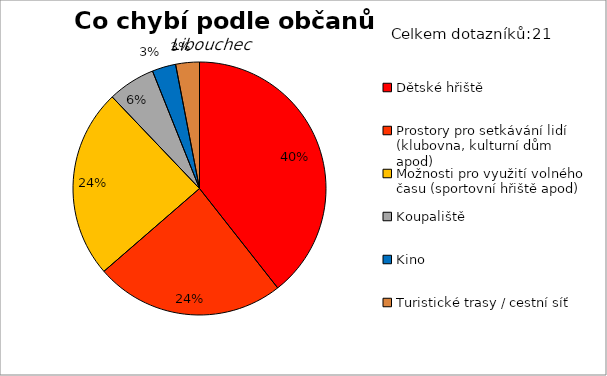
| Category | Series 0 |
|---|---|
| Dětské hřiště | 13 |
| Prostory pro setkávání lidí (klubovna, kulturní dům apod) | 8 |
| Možnosti pro využití volného času (sportovní hřiště apod) | 8 |
| Koupaliště | 2 |
| Kino | 1 |
| Turistické trasy / cestní síť | 1 |